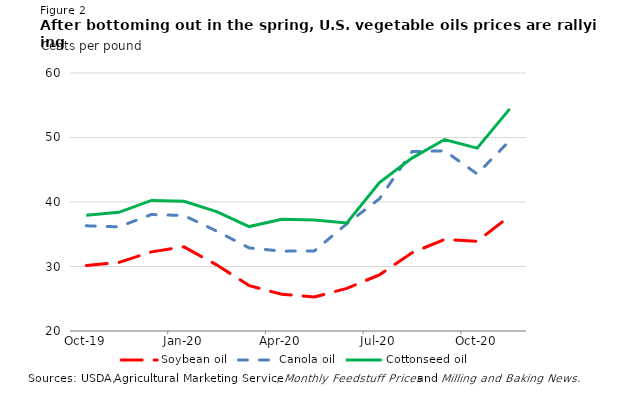
| Category | Soybean oil | Canola oil | Cottonseed oil |
|---|---|---|---|
| 2019-10-01 | 30.14 | 36.31 | 37.94 |
| 2019-11-01 | 30.62 | 36.15 | 38.4 |
| 2019-12-01 | 32.27 | 38.06 | 40.25 |
| 2020-01-01 | 33.04 | 37.9 | 40.1 |
| 2020-02-01 | 30.26 | 35.5 | 38.5 |
| 2020-03-01 | 27.04 | 32.88 | 36.19 |
| 2020-04-01 | 25.69 | 32.38 | 37.31 |
| 2020-05-01 | 25.27 | 32.4 | 37.2 |
| 2020-06-01 | 26.61 | 36.63 | 36.75 |
| 2020-07-01 | 28.71 | 40.5 | 43 |
| 2020-08-01 | 32.13 | 47.81 | 46.81 |
| 2020-09-01 | 34.2 | 47.94 | 49.69 |
| 2020-10-01 | 33.92 | 44.35 | 48.35 |
| 2020-11-01 | 37.79 | 49.5 | 54.44 |